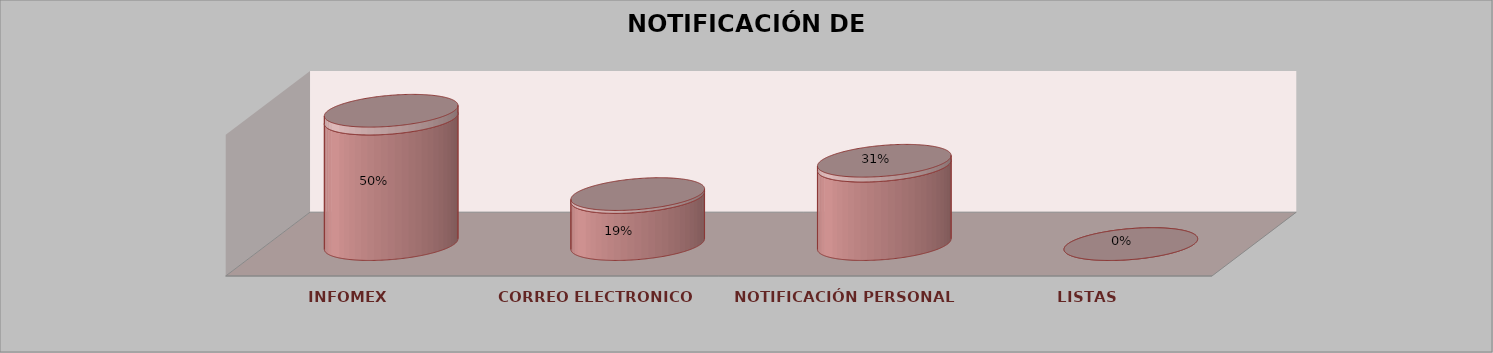
| Category | Series 0 | Series 1 | Series 2 | Series 3 | Series 4 |
|---|---|---|---|---|---|
| INFOMEX |  |  |  | 8 | 0.5 |
| CORREO ELECTRONICO |  |  |  | 3 | 0.188 |
| NOTIFICACIÓN PERSONAL |  |  |  | 5 | 0.312 |
| LISTAS |  |  |  | 0 | 0 |